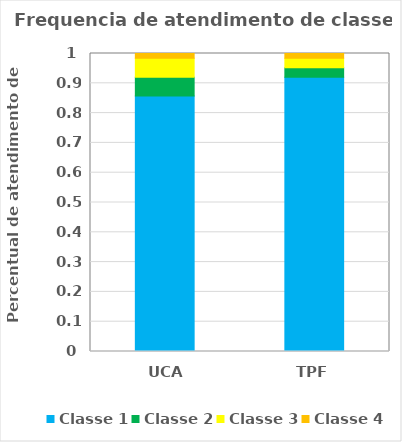
| Category | Classe 1 | Classe 2 | Classe 3 | Classe 4 |
|---|---|---|---|---|
| UCA | 0.857 | 0.063 | 0.063 | 0.016 |
| TPF | 0.921 | 0.032 | 0.032 | 0.016 |